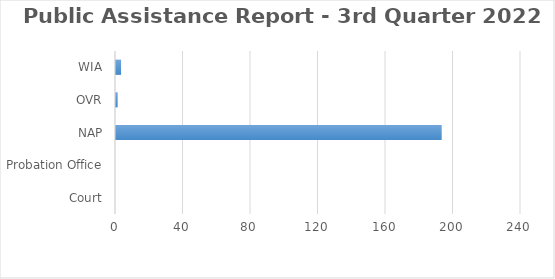
| Category | Series 0 |
|---|---|
| Court | 0 |
| Probation Office | 0 |
| NAP | 193 |
| OVR | 1 |
| WIA | 3 |